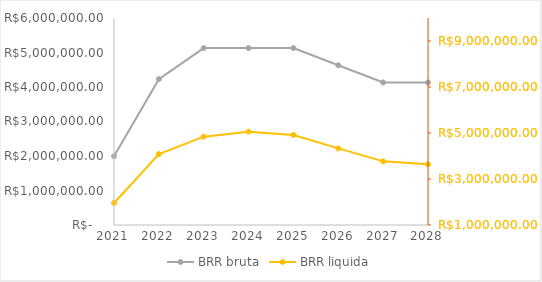
| Category | BRR bruta |
|---|---|
| 2021.0 | 1993122.955 |
| 2022.0 | 4227712.795 |
| 2023.0 | 5127068.317 |
| 2024.0 | 5127068.317 |
| 2025.0 | 5127068.317 |
| 2026.0 | 4628787.578 |
| 2027.0 | 4130506.84 |
| 2028.0 | 4130506.84 |